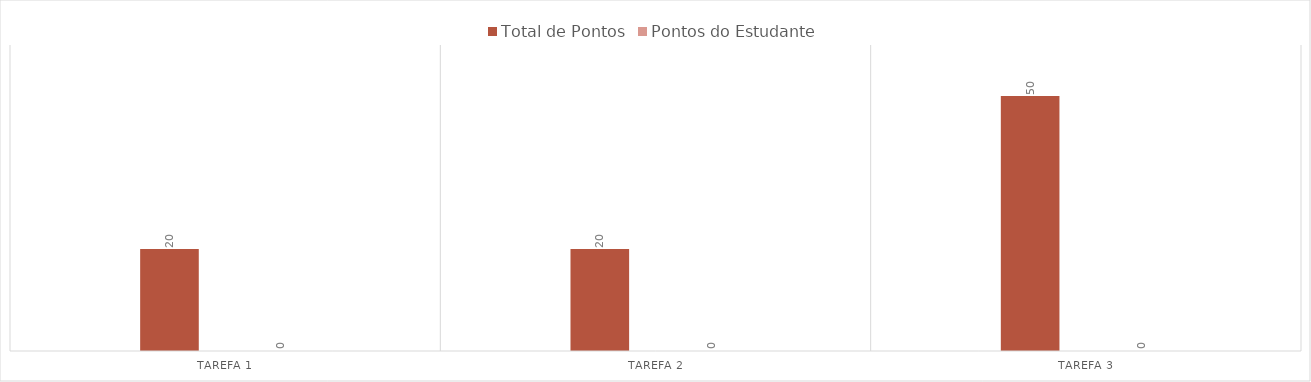
| Category | Total de Pontos | Pontos do Estudante |
|---|---|---|
| Tarefa 1 | 20 | 20 |
| Tarefa 2 | 20 | 20 |
| Tarefa 3 | 50 | 50 |